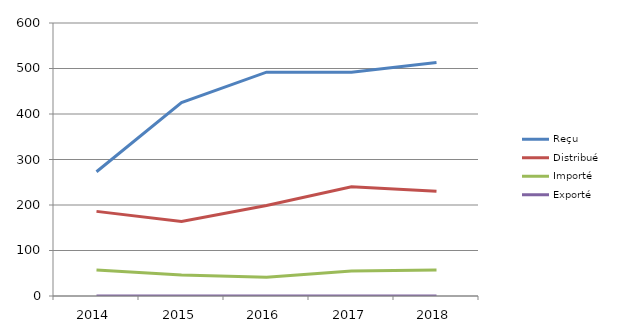
| Category | Reçu | Distribué | Importé | Exporté |
|---|---|---|---|---|
| 2014.0 | 273 | 186 | 57 | 0 |
| 2015.0 | 425 | 164 | 46 | 0 |
| 2016.0 | 492 | 199 | 41 | 0 |
| 2017.0 | 492 | 240 | 55 | 0 |
| 2018.0 | 513 | 230 | 57 | 0 |